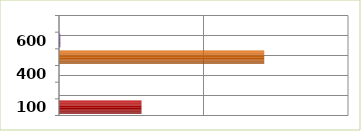
| Category | Series 0 |
|---|---|
| 100.0 | 28535846.52 |
| 200.0 | 0 |
| 400.0 | 0 |
| 500.0 | 71010031.69 |
| 600.0 | 450140.24 |
| 700.0 | 0 |